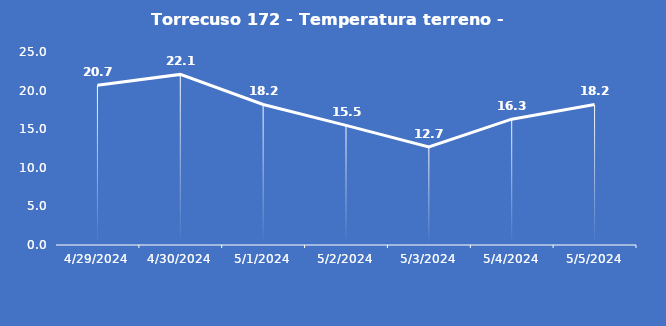
| Category | Torrecuso 172 - Temperatura terreno - Grezzo (°C) |
|---|---|
| 4/29/24 | 20.7 |
| 4/30/24 | 22.1 |
| 5/1/24 | 18.2 |
| 5/2/24 | 15.5 |
| 5/3/24 | 12.7 |
| 5/4/24 | 16.3 |
| 5/5/24 | 18.2 |